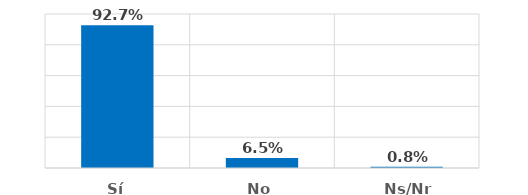
| Category | Series 0 |
|---|---|
| Sí | 0.927 |
| No | 0.065 |
| Ns/Nr | 0.008 |